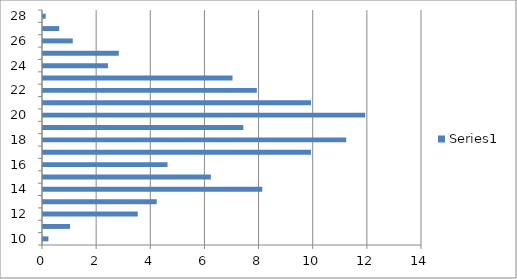
| Category | Series 0 |
|---|---|
| 10.0 | 0.2 |
| 11.0 | 1 |
| 12.0 | 3.5 |
| 13.0 | 4.2 |
| 14.0 | 8.1 |
| 15.0 | 6.2 |
| 16.0 | 4.6 |
| 17.0 | 9.9 |
| 18.0 | 11.2 |
| 19.0 | 7.4 |
| 20.0 | 11.9 |
| 21.0 | 9.9 |
| 22.0 | 7.9 |
| 23.0 | 7 |
| 24.0 | 2.4 |
| 25.0 | 2.8 |
| 26.0 | 1.1 |
| 27.0 | 0.6 |
| 28.0 | 0.1 |